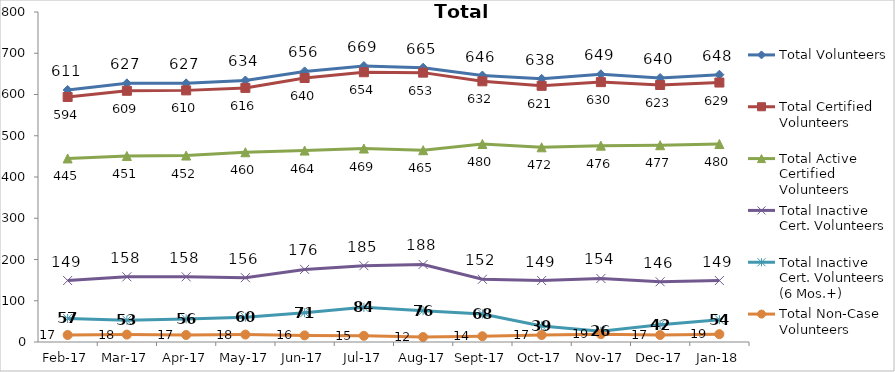
| Category | Total Volunteers | Total Certified Volunteers | Total Active Certified Volunteers | Total Inactive Cert. Volunteers | Total Inactive Cert. Volunteers (6 Mos.+) | Total Non-Case Volunteers |
|---|---|---|---|---|---|---|
| 2017-02-01 | 611 | 594 | 445 | 149 | 57 | 17 |
| 2017-03-01 | 627 | 609 | 451 | 158 | 53 | 18 |
| 2017-04-01 | 627 | 610 | 452 | 158 | 56 | 17 |
| 2017-05-01 | 634 | 616 | 460 | 156 | 60 | 18 |
| 2017-06-01 | 656 | 640 | 464 | 176 | 71 | 16 |
| 2017-07-01 | 669 | 654 | 469 | 185 | 84 | 15 |
| 2017-08-01 | 665 | 653 | 465 | 188 | 76 | 12 |
| 2017-09-01 | 646 | 632 | 480 | 152 | 68 | 14 |
| 2017-10-01 | 638 | 621 | 472 | 149 | 39 | 17 |
| 2017-11-01 | 649 | 630 | 476 | 154 | 26 | 19 |
| 2017-12-01 | 640 | 623 | 477 | 146 | 42 | 17 |
| 2018-01-01 | 648 | 629 | 480 | 149 | 54 | 19 |